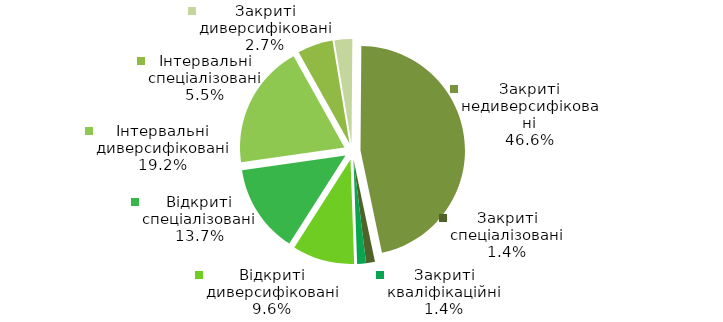
| Category | Series 0 |
|---|---|
| Відкриті диверсифіковані | 7 |
| Відкриті спеціалізовані | 10 |
| Інтервальні диверсифіковані | 14 |
| Інтервальні спеціалізовані | 4 |
| Закриті диверсифіковані | 2 |
| Закриті недиверсифіковані | 34 |
| Закриті спеціалізовані | 1 |
| Закриті кваліфікаційні | 1 |